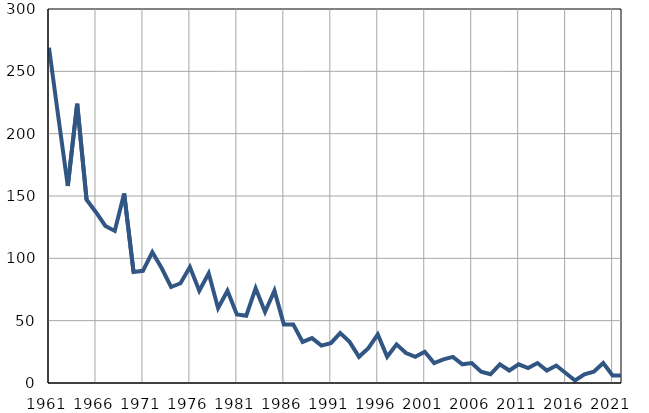
| Category | Умрла 
одојчад |
|---|---|
| 1961.0 | 269 |
| 1962.0 | 213 |
| 1963.0 | 158 |
| 1964.0 | 224 |
| 1965.0 | 147 |
| 1966.0 | 137 |
| 1967.0 | 126 |
| 1968.0 | 122 |
| 1969.0 | 152 |
| 1970.0 | 89 |
| 1971.0 | 90 |
| 1972.0 | 105 |
| 1973.0 | 92 |
| 1974.0 | 77 |
| 1975.0 | 80 |
| 1976.0 | 93 |
| 1977.0 | 74 |
| 1978.0 | 88 |
| 1979.0 | 60 |
| 1980.0 | 74 |
| 1981.0 | 55 |
| 1982.0 | 54 |
| 1983.0 | 76 |
| 1984.0 | 57 |
| 1985.0 | 74 |
| 1986.0 | 47 |
| 1987.0 | 47 |
| 1988.0 | 33 |
| 1989.0 | 36 |
| 1990.0 | 30 |
| 1991.0 | 32 |
| 1992.0 | 40 |
| 1993.0 | 33 |
| 1994.0 | 21 |
| 1995.0 | 28 |
| 1996.0 | 39 |
| 1997.0 | 21 |
| 1998.0 | 31 |
| 1999.0 | 24 |
| 2000.0 | 21 |
| 2001.0 | 25 |
| 2002.0 | 16 |
| 2003.0 | 19 |
| 2004.0 | 21 |
| 2005.0 | 15 |
| 2006.0 | 16 |
| 2007.0 | 9 |
| 2008.0 | 7 |
| 2009.0 | 15 |
| 2010.0 | 10 |
| 2011.0 | 15 |
| 2012.0 | 12 |
| 2013.0 | 16 |
| 2014.0 | 10 |
| 2015.0 | 14 |
| 2016.0 | 8 |
| 2017.0 | 2 |
| 2018.0 | 7 |
| 2019.0 | 9 |
| 2020.0 | 16 |
| 2021.0 | 6 |
| 2022.0 | 6 |